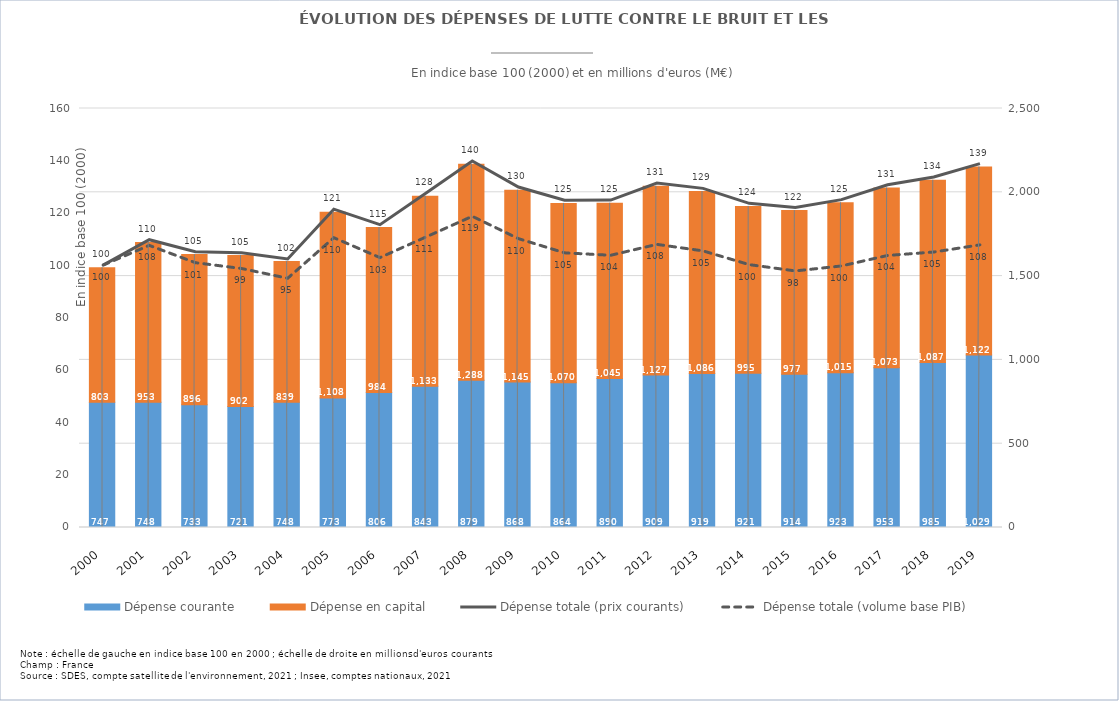
| Category | Dépense courante | Dépense en capital |
|---|---|---|
| 2000.0 | 746.938 | 803.155 |
| 2001.0 | 747.549 | 952.892 |
| 2002.0 | 732.946 | 896.079 |
| 2003.0 | 721.329 | 901.503 |
| 2004.0 | 747.699 | 839.101 |
| 2005.0 | 773.193 | 1108.131 |
| 2006.0 | 805.865 | 983.783 |
| 2007.0 | 843.44 | 1133 |
| 2008.0 | 878.805 | 1288.068 |
| 2009.0 | 868.006 | 1144.563 |
| 2010.0 | 863.573 | 1070.224 |
| 2011.0 | 889.529 | 1045.322 |
| 2012.0 | 909.221 | 1126.575 |
| 2013.0 | 918.601 | 1085.797 |
| 2014.0 | 920.539 | 995.165 |
| 2015.0 | 913.912 | 976.982 |
| 2016.0 | 922.61 | 1015.118 |
| 2017.0 | 953.127 | 1072.928 |
| 2018.0 | 985.166 | 1086.857 |
| 2019.0 | 1029.173 | 1121.966 |